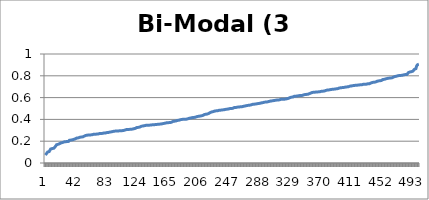
| Category | Bi-Modal (3 dice) |
|---|---|
| 0 | 0.073 |
| 1 | 0.076 |
| 2 | 0.091 |
| 3 | 0.101 |
| 4 | 0.101 |
| 5 | 0.104 |
| 6 | 0.106 |
| 7 | 0.128 |
| 8 | 0.132 |
| 9 | 0.132 |
| 10 | 0.133 |
| 11 | 0.135 |
| 12 | 0.138 |
| 13 | 0.149 |
| 14 | 0.158 |
| 15 | 0.168 |
| 16 | 0.169 |
| 17 | 0.171 |
| 18 | 0.172 |
| 19 | 0.177 |
| 20 | 0.181 |
| 21 | 0.185 |
| 22 | 0.187 |
| 23 | 0.188 |
| 24 | 0.189 |
| 25 | 0.194 |
| 26 | 0.194 |
| 27 | 0.195 |
| 28 | 0.196 |
| 29 | 0.198 |
| 30 | 0.198 |
| 31 | 0.198 |
| 32 | 0.208 |
| 33 | 0.209 |
| 34 | 0.21 |
| 35 | 0.211 |
| 36 | 0.213 |
| 37 | 0.215 |
| 38 | 0.217 |
| 39 | 0.218 |
| 40 | 0.222 |
| 41 | 0.227 |
| 42 | 0.229 |
| 43 | 0.229 |
| 44 | 0.231 |
| 45 | 0.231 |
| 46 | 0.236 |
| 47 | 0.238 |
| 48 | 0.238 |
| 49 | 0.24 |
| 50 | 0.24 |
| 51 | 0.247 |
| 52 | 0.247 |
| 53 | 0.251 |
| 54 | 0.253 |
| 55 | 0.253 |
| 56 | 0.256 |
| 57 | 0.256 |
| 58 | 0.257 |
| 59 | 0.257 |
| 60 | 0.258 |
| 61 | 0.258 |
| 62 | 0.259 |
| 63 | 0.262 |
| 64 | 0.263 |
| 65 | 0.264 |
| 66 | 0.264 |
| 67 | 0.265 |
| 68 | 0.265 |
| 69 | 0.265 |
| 70 | 0.265 |
| 71 | 0.266 |
| 72 | 0.27 |
| 73 | 0.27 |
| 74 | 0.271 |
| 75 | 0.272 |
| 76 | 0.272 |
| 77 | 0.274 |
| 78 | 0.275 |
| 79 | 0.275 |
| 80 | 0.276 |
| 81 | 0.279 |
| 82 | 0.279 |
| 83 | 0.28 |
| 84 | 0.28 |
| 85 | 0.28 |
| 86 | 0.284 |
| 87 | 0.286 |
| 88 | 0.286 |
| 89 | 0.289 |
| 90 | 0.289 |
| 91 | 0.292 |
| 92 | 0.292 |
| 93 | 0.293 |
| 94 | 0.293 |
| 95 | 0.293 |
| 96 | 0.293 |
| 97 | 0.294 |
| 98 | 0.295 |
| 99 | 0.295 |
| 100 | 0.296 |
| 101 | 0.296 |
| 102 | 0.297 |
| 103 | 0.297 |
| 104 | 0.298 |
| 105 | 0.299 |
| 106 | 0.302 |
| 107 | 0.304 |
| 108 | 0.307 |
| 109 | 0.307 |
| 110 | 0.307 |
| 111 | 0.308 |
| 112 | 0.308 |
| 113 | 0.309 |
| 114 | 0.309 |
| 115 | 0.31 |
| 116 | 0.311 |
| 117 | 0.314 |
| 118 | 0.314 |
| 119 | 0.317 |
| 120 | 0.318 |
| 121 | 0.323 |
| 122 | 0.326 |
| 123 | 0.326 |
| 124 | 0.327 |
| 125 | 0.33 |
| 126 | 0.33 |
| 127 | 0.331 |
| 128 | 0.338 |
| 129 | 0.338 |
| 130 | 0.339 |
| 131 | 0.34 |
| 132 | 0.343 |
| 133 | 0.344 |
| 134 | 0.345 |
| 135 | 0.346 |
| 136 | 0.347 |
| 137 | 0.347 |
| 138 | 0.347 |
| 139 | 0.348 |
| 140 | 0.348 |
| 141 | 0.349 |
| 142 | 0.35 |
| 143 | 0.351 |
| 144 | 0.352 |
| 145 | 0.352 |
| 146 | 0.352 |
| 147 | 0.353 |
| 148 | 0.354 |
| 149 | 0.355 |
| 150 | 0.355 |
| 151 | 0.356 |
| 152 | 0.356 |
| 153 | 0.357 |
| 154 | 0.358 |
| 155 | 0.36 |
| 156 | 0.36 |
| 157 | 0.361 |
| 158 | 0.363 |
| 159 | 0.364 |
| 160 | 0.366 |
| 161 | 0.369 |
| 162 | 0.37 |
| 163 | 0.37 |
| 164 | 0.37 |
| 165 | 0.371 |
| 166 | 0.371 |
| 167 | 0.373 |
| 168 | 0.373 |
| 169 | 0.379 |
| 170 | 0.381 |
| 171 | 0.382 |
| 172 | 0.384 |
| 173 | 0.385 |
| 174 | 0.385 |
| 175 | 0.387 |
| 176 | 0.39 |
| 177 | 0.391 |
| 178 | 0.392 |
| 179 | 0.395 |
| 180 | 0.397 |
| 181 | 0.398 |
| 182 | 0.4 |
| 183 | 0.4 |
| 184 | 0.401 |
| 185 | 0.402 |
| 186 | 0.402 |
| 187 | 0.402 |
| 188 | 0.402 |
| 189 | 0.404 |
| 190 | 0.406 |
| 191 | 0.411 |
| 192 | 0.411 |
| 193 | 0.412 |
| 194 | 0.413 |
| 195 | 0.415 |
| 196 | 0.416 |
| 197 | 0.417 |
| 198 | 0.418 |
| 199 | 0.419 |
| 200 | 0.42 |
| 201 | 0.424 |
| 202 | 0.426 |
| 203 | 0.427 |
| 204 | 0.428 |
| 205 | 0.429 |
| 206 | 0.43 |
| 207 | 0.432 |
| 208 | 0.433 |
| 209 | 0.434 |
| 210 | 0.436 |
| 211 | 0.437 |
| 212 | 0.445 |
| 213 | 0.445 |
| 214 | 0.447 |
| 215 | 0.449 |
| 216 | 0.449 |
| 217 | 0.454 |
| 218 | 0.455 |
| 219 | 0.46 |
| 220 | 0.464 |
| 221 | 0.464 |
| 222 | 0.469 |
| 223 | 0.469 |
| 224 | 0.472 |
| 225 | 0.474 |
| 226 | 0.477 |
| 227 | 0.478 |
| 228 | 0.479 |
| 229 | 0.479 |
| 230 | 0.48 |
| 231 | 0.48 |
| 232 | 0.484 |
| 233 | 0.485 |
| 234 | 0.485 |
| 235 | 0.486 |
| 236 | 0.487 |
| 237 | 0.488 |
| 238 | 0.488 |
| 239 | 0.488 |
| 240 | 0.492 |
| 241 | 0.494 |
| 242 | 0.494 |
| 243 | 0.494 |
| 244 | 0.496 |
| 245 | 0.496 |
| 246 | 0.499 |
| 247 | 0.499 |
| 248 | 0.5 |
| 249 | 0.501 |
| 250 | 0.502 |
| 251 | 0.502 |
| 252 | 0.509 |
| 253 | 0.509 |
| 254 | 0.509 |
| 255 | 0.51 |
| 256 | 0.513 |
| 257 | 0.513 |
| 258 | 0.513 |
| 259 | 0.515 |
| 260 | 0.516 |
| 261 | 0.516 |
| 262 | 0.516 |
| 263 | 0.517 |
| 264 | 0.52 |
| 265 | 0.52 |
| 266 | 0.523 |
| 267 | 0.524 |
| 268 | 0.526 |
| 269 | 0.527 |
| 270 | 0.529 |
| 271 | 0.529 |
| 272 | 0.53 |
| 273 | 0.531 |
| 274 | 0.532 |
| 275 | 0.537 |
| 276 | 0.538 |
| 277 | 0.538 |
| 278 | 0.539 |
| 279 | 0.54 |
| 280 | 0.541 |
| 281 | 0.542 |
| 282 | 0.543 |
| 283 | 0.546 |
| 284 | 0.546 |
| 285 | 0.547 |
| 286 | 0.548 |
| 287 | 0.549 |
| 288 | 0.551 |
| 289 | 0.554 |
| 290 | 0.554 |
| 291 | 0.554 |
| 292 | 0.558 |
| 293 | 0.558 |
| 294 | 0.559 |
| 295 | 0.559 |
| 296 | 0.561 |
| 297 | 0.563 |
| 298 | 0.565 |
| 299 | 0.567 |
| 300 | 0.568 |
| 301 | 0.57 |
| 302 | 0.57 |
| 303 | 0.571 |
| 304 | 0.572 |
| 305 | 0.573 |
| 306 | 0.574 |
| 307 | 0.576 |
| 308 | 0.577 |
| 309 | 0.578 |
| 310 | 0.578 |
| 311 | 0.578 |
| 312 | 0.579 |
| 313 | 0.581 |
| 314 | 0.584 |
| 315 | 0.584 |
| 316 | 0.585 |
| 317 | 0.585 |
| 318 | 0.585 |
| 319 | 0.586 |
| 320 | 0.586 |
| 321 | 0.589 |
| 322 | 0.59 |
| 323 | 0.59 |
| 324 | 0.593 |
| 325 | 0.596 |
| 326 | 0.599 |
| 327 | 0.601 |
| 328 | 0.604 |
| 329 | 0.606 |
| 330 | 0.606 |
| 331 | 0.607 |
| 332 | 0.612 |
| 333 | 0.613 |
| 334 | 0.613 |
| 335 | 0.614 |
| 336 | 0.615 |
| 337 | 0.616 |
| 338 | 0.618 |
| 339 | 0.618 |
| 340 | 0.619 |
| 341 | 0.619 |
| 342 | 0.62 |
| 343 | 0.621 |
| 344 | 0.624 |
| 345 | 0.624 |
| 346 | 0.628 |
| 347 | 0.628 |
| 348 | 0.629 |
| 349 | 0.63 |
| 350 | 0.631 |
| 351 | 0.631 |
| 352 | 0.636 |
| 353 | 0.637 |
| 354 | 0.642 |
| 355 | 0.643 |
| 356 | 0.648 |
| 357 | 0.649 |
| 358 | 0.649 |
| 359 | 0.65 |
| 360 | 0.65 |
| 361 | 0.651 |
| 362 | 0.652 |
| 363 | 0.652 |
| 364 | 0.653 |
| 365 | 0.653 |
| 366 | 0.654 |
| 367 | 0.655 |
| 368 | 0.658 |
| 369 | 0.658 |
| 370 | 0.659 |
| 371 | 0.66 |
| 372 | 0.661 |
| 373 | 0.665 |
| 374 | 0.666 |
| 375 | 0.668 |
| 376 | 0.67 |
| 377 | 0.67 |
| 378 | 0.67 |
| 379 | 0.673 |
| 380 | 0.673 |
| 381 | 0.674 |
| 382 | 0.676 |
| 383 | 0.676 |
| 384 | 0.677 |
| 385 | 0.678 |
| 386 | 0.678 |
| 387 | 0.679 |
| 388 | 0.681 |
| 389 | 0.683 |
| 390 | 0.683 |
| 391 | 0.686 |
| 392 | 0.688 |
| 393 | 0.689 |
| 394 | 0.69 |
| 395 | 0.691 |
| 396 | 0.692 |
| 397 | 0.693 |
| 398 | 0.694 |
| 399 | 0.694 |
| 400 | 0.696 |
| 401 | 0.696 |
| 402 | 0.698 |
| 403 | 0.698 |
| 404 | 0.699 |
| 405 | 0.704 |
| 406 | 0.705 |
| 407 | 0.706 |
| 408 | 0.707 |
| 409 | 0.708 |
| 410 | 0.709 |
| 411 | 0.71 |
| 412 | 0.712 |
| 413 | 0.713 |
| 414 | 0.713 |
| 415 | 0.713 |
| 416 | 0.714 |
| 417 | 0.714 |
| 418 | 0.716 |
| 419 | 0.716 |
| 420 | 0.717 |
| 421 | 0.718 |
| 422 | 0.718 |
| 423 | 0.719 |
| 424 | 0.722 |
| 425 | 0.723 |
| 426 | 0.723 |
| 427 | 0.723 |
| 428 | 0.723 |
| 429 | 0.724 |
| 430 | 0.727 |
| 431 | 0.727 |
| 432 | 0.727 |
| 433 | 0.734 |
| 434 | 0.734 |
| 435 | 0.735 |
| 436 | 0.739 |
| 437 | 0.74 |
| 438 | 0.741 |
| 439 | 0.741 |
| 440 | 0.743 |
| 441 | 0.746 |
| 442 | 0.749 |
| 443 | 0.752 |
| 444 | 0.753 |
| 445 | 0.753 |
| 446 | 0.754 |
| 447 | 0.755 |
| 448 | 0.757 |
| 449 | 0.759 |
| 450 | 0.766 |
| 451 | 0.767 |
| 452 | 0.768 |
| 453 | 0.772 |
| 454 | 0.772 |
| 455 | 0.774 |
| 456 | 0.776 |
| 457 | 0.778 |
| 458 | 0.778 |
| 459 | 0.779 |
| 460 | 0.779 |
| 461 | 0.78 |
| 462 | 0.781 |
| 463 | 0.784 |
| 464 | 0.787 |
| 465 | 0.792 |
| 466 | 0.794 |
| 467 | 0.795 |
| 468 | 0.796 |
| 469 | 0.798 |
| 470 | 0.8 |
| 471 | 0.801 |
| 472 | 0.803 |
| 473 | 0.803 |
| 474 | 0.803 |
| 475 | 0.804 |
| 476 | 0.805 |
| 477 | 0.808 |
| 478 | 0.809 |
| 479 | 0.811 |
| 480 | 0.811 |
| 481 | 0.812 |
| 482 | 0.812 |
| 483 | 0.816 |
| 484 | 0.829 |
| 485 | 0.829 |
| 486 | 0.835 |
| 487 | 0.836 |
| 488 | 0.838 |
| 489 | 0.838 |
| 490 | 0.843 |
| 491 | 0.851 |
| 492 | 0.859 |
| 493 | 0.86 |
| 494 | 0.865 |
| 495 | 0.889 |
| 496 | 0.9 |
| 497 | 0.905 |
| 498 | 0.907 |
| 499 | 0.912 |